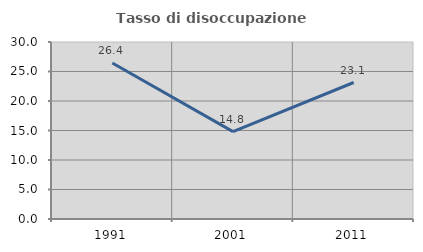
| Category | Tasso di disoccupazione giovanile  |
|---|---|
| 1991.0 | 26.449 |
| 2001.0 | 14.815 |
| 2011.0 | 23.134 |